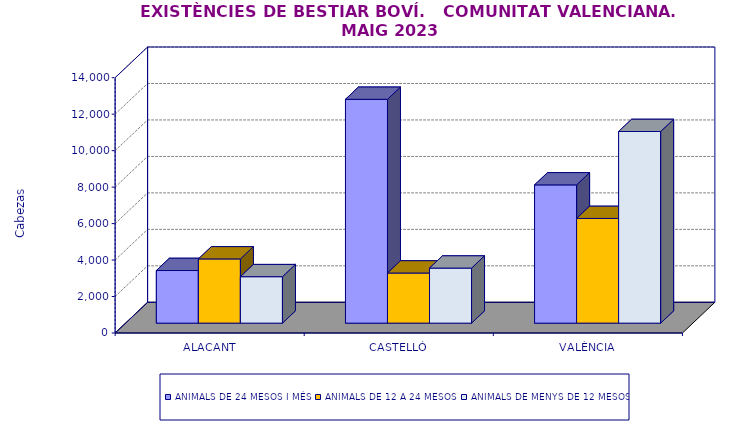
| Category | ANIMALS DE 24 MESOS I MÉS | ANIMALS DE 12 A 24 MESOS | ANIMALS DE MENYS DE 12 MESOS |
|---|---|---|---|
| ALACANT | 2886 | 3522 | 2547 |
| CASTELLÓ | 12275 | 2749 | 3019 |
| VALÈNCIA | 7582 | 5741 | 10509 |